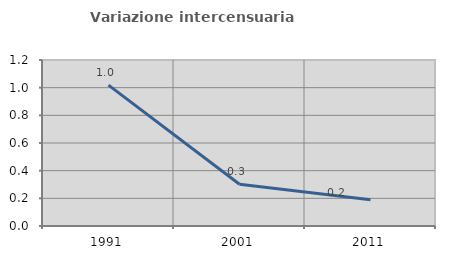
| Category | Variazione intercensuaria annua |
|---|---|
| 1991.0 | 1.019 |
| 2001.0 | 0.302 |
| 2011.0 | 0.189 |